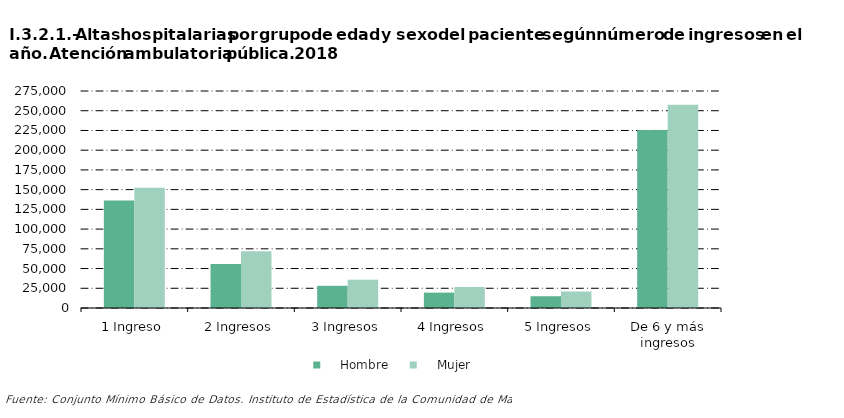
| Category |     Hombre |     Mujer |
|---|---|---|
| 1 Ingreso | 136276 | 152311 |
| 2 Ingresos | 55708 | 71789 |
| 3 Ingresos | 28130 | 35880 |
| 4 Ingresos | 19483 | 26566 |
| 5 Ingresos | 14921 | 20940 |
| De 6 y más ingresos | 225528 | 257598 |